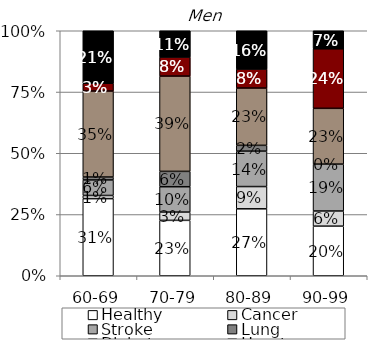
| Category | Healthy | Cancer | Stroke | Lung | Diabetes | Heart | Obesity |
|---|---|---|---|---|---|---|---|
| 60-69 | 0.315 | 0.013 | 0.063 | 0.012 | 0.351 | 0.032 | 0.214 |
| 70-79 | 0.226 | 0.034 | 0.103 | 0.063 | 0.389 | 0.078 | 0.107 |
| 80-89 | 0.273 | 0.091 | 0.145 | 0.024 | 0.234 | 0.078 | 0.156 |
| 90-99 | 0.202 | 0.062 | 0.191 | 0 | 0.228 | 0.243 | 0.074 |